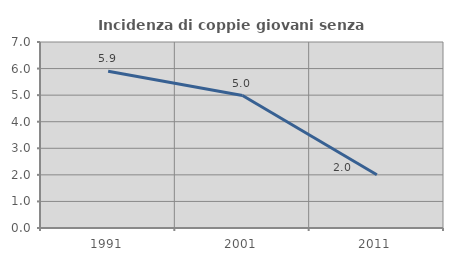
| Category | Incidenza di coppie giovani senza figli |
|---|---|
| 1991.0 | 5.902 |
| 2001.0 | 4.986 |
| 2011.0 | 2.005 |